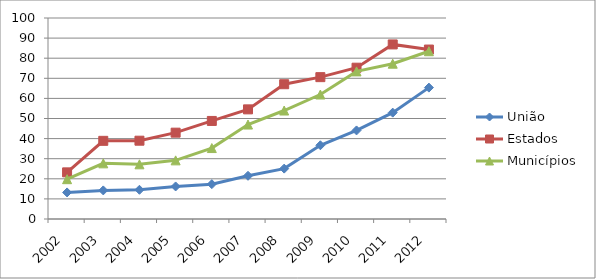
| Category | União | Estados | Municípios |
|---|---|---|---|
| 2002.0 | 13.223 | 23.202 | 19.812 |
| 2003.0 | 14.224 | 38.885 | 27.689 |
| 2004.0 | 14.533 | 38.956 | 27.205 |
| 2005.0 | 16.188 | 42.95 | 29.173 |
| 2006.0 | 17.336 | 48.783 | 35.299 |
| 2007.0 | 21.498 | 54.542 | 46.995 |
| 2008.0 | 25.069 | 67.05 | 53.972 |
| 2009.0 | 36.68 | 70.574 | 61.937 |
| 2010.0 | 44.062 | 75.278 | 73.433 |
| 2011.0 | 52.909 | 86.85 | 77.272 |
| 2012.0 | 65.364 | 84.303 | 83.463 |